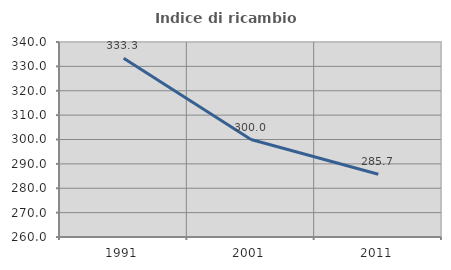
| Category | Indice di ricambio occupazionale  |
|---|---|
| 1991.0 | 333.333 |
| 2001.0 | 300 |
| 2011.0 | 285.714 |